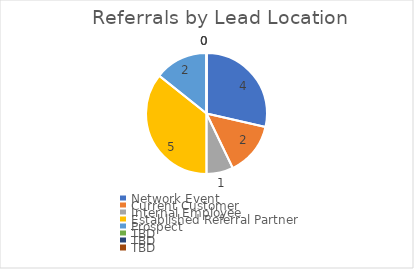
| Category | Referrals by Lead Location |
|---|---|
| Network Event | 4 |
| Current Customer | 2 |
| Internal Employee | 1 |
| Established Referral Partner | 5 |
| Prospect  | 2 |
| TBD | 0 |
| TBD | 0 |
| TBD | 0 |